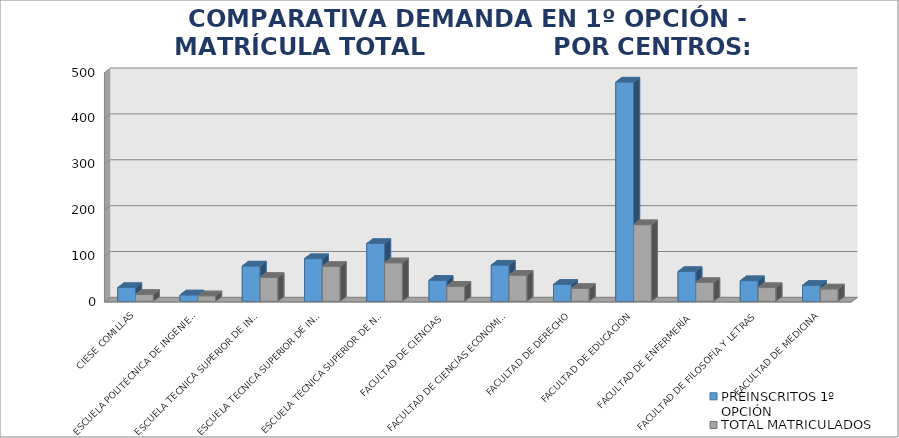
| Category | PREINSCRITOS 1º OPCIÓN | TOTAL MATRICULADOS |
|---|---|---|
| CIESE COMILLAS | 30 | 15 |
| ESCUELA POLITÉCNICA DE INGENIERÍA DE MINAS Y ENERGÍA | 14 | 12 |
| ESCUELA TECNICA SUPERIOR DE INGENIEROS DE CAMINOS, CANALES Y PUERTOS | 77 | 52 |
| ESCUELA TECNICA SUPERIOR DE INGENIEROS INDUSTRIALES Y DE TELECOMUNICACION | 93 | 76 |
| ESCUELA TÉCNICA SUPERIOR DE NÁUTICA | 126 | 84 |
| FACULTAD DE CIENCIAS | 46 | 33 |
| FACULTAD DE CIENCIAS ECONOMICAS Y EMPRESARIALES | 79 | 57 |
| FACULTAD DE DERECHO | 37 | 28 |
| FACULTAD DE EDUCACION | 478 | 167 |
| FACULTAD DE ENFERMERÍA | 65 | 41 |
| FACULTAD DE FILOSOFÍA Y LETRAS | 45 | 30 |
| FACULTAD DE MEDICINA | 35 | 27 |